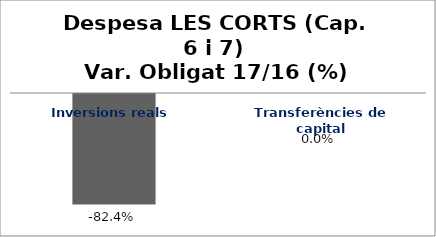
| Category | Series 0 |
|---|---|
| Inversions reals | -0.824 |
| Transferències de capital | 0 |